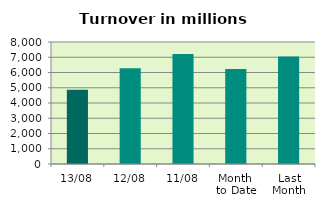
| Category | Series 0 |
|---|---|
| 13/08 | 4870.45 |
| 12/08 | 6281.611 |
| 11/08 | 7212.233 |
| Month 
to Date | 6228.098 |
| Last
Month | 7041.386 |